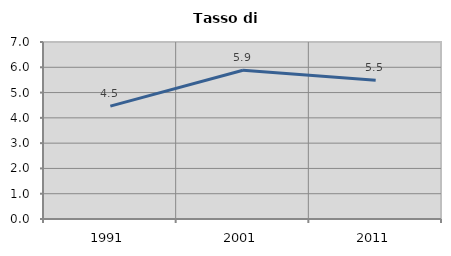
| Category | Tasso di disoccupazione   |
|---|---|
| 1991.0 | 4.464 |
| 2001.0 | 5.882 |
| 2011.0 | 5.489 |